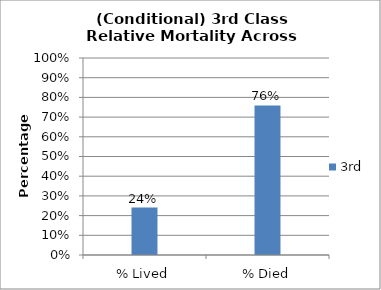
| Category | 3rd |
|---|---|
| % Lived | 0.241 |
| % Died | 0.759 |